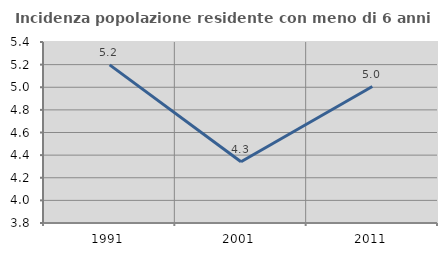
| Category | Incidenza popolazione residente con meno di 6 anni |
|---|---|
| 1991.0 | 5.198 |
| 2001.0 | 4.342 |
| 2011.0 | 5.006 |